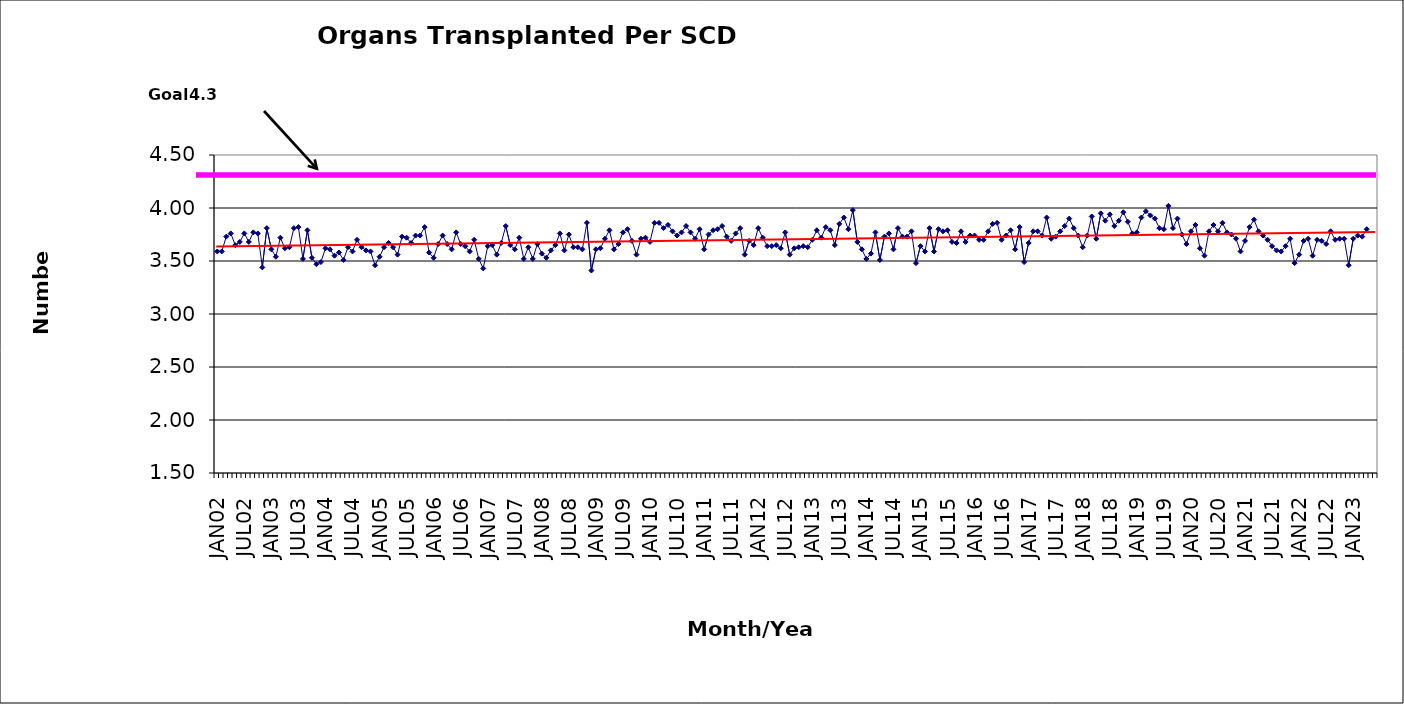
| Category | Series 0 |
|---|---|
| JAN02 | 3.59 |
| FEB02 | 3.59 |
| MAR02 | 3.73 |
| APR02 | 3.76 |
| MAY02 | 3.65 |
| JUN02 | 3.68 |
| JUL02 | 3.76 |
| AUG02 | 3.68 |
| SEP02 | 3.77 |
| OCT02 | 3.76 |
| NOV02 | 3.44 |
| DEC02 | 3.81 |
| JAN03 | 3.61 |
| FEB03 | 3.54 |
| MAR03 | 3.72 |
| APR03 | 3.62 |
| MAY03 | 3.63 |
| JUN03 | 3.81 |
| JUL03 | 3.82 |
| AUG03 | 3.52 |
| SEP03 | 3.79 |
| OCT03 | 3.53 |
| NOV03 | 3.47 |
| DEC03 | 3.49 |
| JAN04 | 3.62 |
| FEB04 | 3.61 |
| MAR04 | 3.55 |
| APR04 | 3.58 |
| MAY04 | 3.51 |
| JUN04 | 3.63 |
| JUL04 | 3.59 |
| AUG04 | 3.7 |
| SEP04 | 3.63 |
| OCT04 | 3.6 |
| NOV04 | 3.59 |
| DEC04 | 3.46 |
| JAN05 | 3.54 |
| FEB05 | 3.63 |
| MAR05 | 3.67 |
| APR05 | 3.63 |
| MAY05 | 3.56 |
| JUN05 | 3.73 |
| JUL05 | 3.72 |
| AUG05 | 3.67 |
| SEP05 | 3.74 |
| OCT05 | 3.74 |
| NOV05 | 3.82 |
| DEC05 | 3.58 |
| JAN06 | 3.53 |
| FEB06 | 3.66 |
| MAR06 | 3.74 |
| APR06 | 3.66 |
| MAY06 | 3.61 |
| JUN06 | 3.77 |
| JUL06 | 3.66 |
| AUG06 | 3.64 |
| SEP06 | 3.59 |
| OCT06 | 3.7 |
| NOV06 | 3.52 |
| DEC06 | 3.43 |
| JAN07 | 3.64 |
| FEB07 | 3.65 |
| MAR07 | 3.56 |
| APR07 | 3.67 |
| MAY07 | 3.83 |
| JUN07 | 3.65 |
| JUL07 | 3.61 |
| AUG07 | 3.72 |
| SEP07 | 3.52 |
| OCT07 | 3.63 |
| NOV07 | 3.52 |
| DEC07 | 3.66 |
| JAN08 | 3.57 |
| FEB08 | 3.53 |
| MAR08 | 3.6 |
| APR08 | 3.65 |
| MAY08 | 3.76 |
| JUN08 | 3.6 |
| JUL08 | 3.75 |
| AUG08 | 3.63 |
| SEP08 | 3.63 |
| OCT08 | 3.61 |
| NOV08 | 3.86 |
| DEC08 | 3.41 |
| JAN09 | 3.61 |
| FEB09 | 3.62 |
| MAR09 | 3.71 |
| APR09 | 3.79 |
| MAY09 | 3.61 |
| JUN09 | 3.66 |
| JUL09 | 3.77 |
| AUG09 | 3.8 |
| SEP09 | 3.69 |
| OCT09 | 3.56 |
| NOV09 | 3.71 |
| DEC09 | 3.72 |
| JAN10 | 3.68 |
| FEB10 | 3.86 |
| MAR10 | 3.86 |
| APR10 | 3.81 |
| MAY10 | 3.84 |
| JUN10 | 3.78 |
| JUL10 | 3.74 |
| AUG10 | 3.77 |
| SEP10 | 3.83 |
| OCT10 | 3.77 |
| NOV10 | 3.71 |
| DEC10 | 3.8 |
| JAN11 | 3.61 |
| FEB11 | 3.75 |
| MAR11 | 3.79 |
| APR11 | 3.8 |
| MAY11 | 3.83 |
| JUN11 | 3.73 |
| JUL11 | 3.69 |
| AUG11 | 3.76 |
| SEP11 | 3.81 |
| OCT11 | 3.56 |
| NOV11 | 3.69 |
| DEC11 | 3.65 |
| JAN12 | 3.81 |
| FEB12 | 3.72 |
| MAR12 | 3.64 |
| APR12 | 3.64 |
| MAY12 | 3.65 |
| JUN12 | 3.62 |
| JUL12 | 3.77 |
| AUG12 | 3.56 |
| SEP12 | 3.62 |
| OCT12 | 3.63 |
| NOV12 | 3.64 |
| DEC12 | 3.63 |
| JAN13 | 3.7 |
| FEB13 | 3.79 |
| MAR13 | 3.72 |
| APR13 | 3.82 |
| MAY13 | 3.79 |
| JUN13 | 3.65 |
| JUL13 | 3.85 |
| AUG13 | 3.91 |
| SEP13 | 3.8 |
| OCT13 | 3.98 |
| NOV13 | 3.68 |
| DEC13 | 3.61 |
| JAN14 | 3.52 |
| FEB14 | 3.57 |
| MAR14 | 3.77 |
| APR14 | 3.51 |
| MAY14 | 3.73 |
| JUN14 | 3.76 |
| JUL14 | 3.61 |
| AUG14 | 3.81 |
| SEP14 | 3.73 |
| OCT14 | 3.73 |
| NOV14 | 3.78 |
| DEC14 | 3.48 |
| JAN15 | 3.64 |
| FEB15 | 3.59 |
| MAR15 | 3.81 |
| APR15 | 3.59 |
| MAY15 | 3.8 |
| JUN15 | 3.78 |
| JUL15 | 3.79 |
| AUG15 | 3.68 |
| SEP15 | 3.67 |
| OCT15 | 3.78 |
| NOV15 | 3.68 |
| DEC15 | 3.74 |
| JAN16 | 3.74 |
| FEB16 | 3.7 |
| MAR16 | 3.7 |
| APR16 | 3.78 |
| MAY16 | 3.85 |
| JUN16 | 3.86 |
| JUL16 | 3.7 |
| AUG16 | 3.74 |
| SEP16 | 3.79 |
| OCT16 | 3.61 |
| NOV16 | 3.82 |
| DEC16 | 3.49 |
| JAN17 | 3.67 |
| FEB17 | 3.78 |
| MAR17 | 3.78 |
| APR17 | 3.74 |
| MAY17 | 3.91 |
| JUN17 | 3.71 |
| JUL17 | 3.73 |
| AUG17 | 3.78 |
| SEP17 | 3.83 |
| OCT17 | 3.9 |
| NOV17 | 3.81 |
| DEC17 | 3.74 |
| JAN18 | 3.63 |
| FEB18 | 3.74 |
| MAR18 | 3.92 |
| APR18 | 3.71 |
| MAY18 | 3.95 |
| JUN18 | 3.88 |
| JUL18 | 3.94 |
| AUG18 | 3.83 |
| SEP18 | 3.88 |
| OCT18 | 3.96 |
| NOV18 | 3.87 |
| DEC18 | 3.76 |
| JAN19 | 3.77 |
| FEB19 | 3.91 |
| MAR19 | 3.97 |
| APR19 | 3.93 |
| MAY19 | 3.9 |
| JUN19 | 3.81 |
| JUL19 | 3.8 |
| AUG19 | 4.02 |
| SEP19 | 3.81 |
| OCT19 | 3.9 |
| NOV19 | 3.75 |
| DEC19 | 3.66 |
| JAN20 | 3.78 |
| FEB20 | 3.84 |
| MAR20 | 3.62 |
| APR20 | 3.55 |
| MAY20 | 3.78 |
| JUN20 | 3.84 |
| JUL20 | 3.78 |
| AUG20 | 3.86 |
| SEP20 | 3.77 |
| OCT20 | 3.75 |
| NOV20 | 3.71 |
| DEC20 | 3.59 |
| JAN21 | 3.69 |
| FEB21 | 3.82 |
| MAR21 | 3.89 |
| APR21 | 3.78 |
| MAY21 | 3.74 |
| JUN21 | 3.7 |
| JUL21 | 3.64 |
| AUG21 | 3.6 |
| SEP21 | 3.59 |
| OCT21 | 3.64 |
| NOV21 | 3.71 |
| DEC21 | 3.48 |
| JAN22 | 3.56 |
| FEB22 | 3.69 |
| MAR22 | 3.71 |
| APR22 | 3.55 |
| MAY22 | 3.7 |
| JUN22 | 3.69 |
| JUL22 | 3.66 |
| AUG22 | 3.78 |
| SEP22 | 3.7 |
| OCT22 | 3.71 |
| NOV22 | 3.71 |
| DEC22 | 3.46 |
| JAN23 | 3.71 |
| FEB23 | 3.74 |
| MAR23 | 3.73 |
| APR23 | 3.8 |